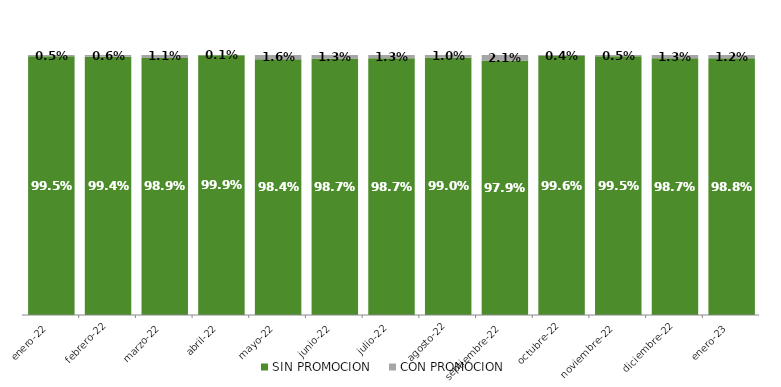
| Category | SIN PROMOCION   | CON PROMOCION   |
|---|---|---|
| 2022-01-01 | 0.995 | 0.005 |
| 2022-02-01 | 0.994 | 0.006 |
| 2022-03-01 | 0.989 | 0.011 |
| 2022-04-01 | 0.999 | 0.001 |
| 2022-05-01 | 0.984 | 0.016 |
| 2022-06-01 | 0.987 | 0.013 |
| 2022-07-01 | 0.987 | 0.013 |
| 2022-08-01 | 0.99 | 0.01 |
| 2022-09-01 | 0.979 | 0.021 |
| 2022-10-01 | 0.996 | 0.004 |
| 2022-11-01 | 0.995 | 0.005 |
| 2022-12-01 | 0.987 | 0.013 |
| 2023-01-01 | 0.988 | 0.012 |